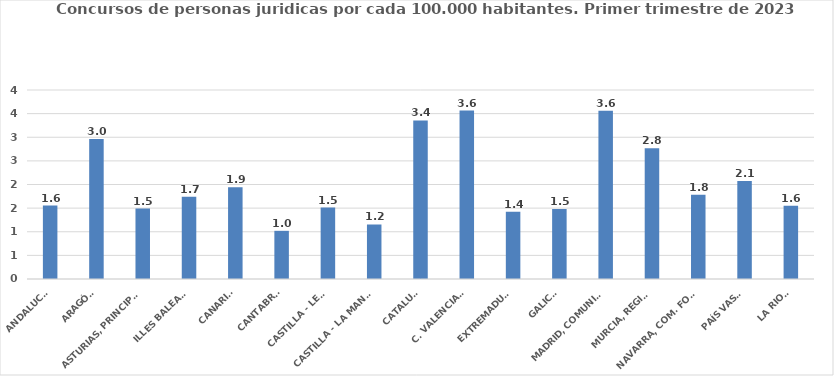
| Category | Series 0 |
|---|---|
| ANDALUCÍA | 1.555 |
| ARAGÓN | 2.964 |
| ASTURIAS, PRINCIPADO | 1.49 |
| ILLES BALEARS | 1.74 |
| CANARIAS | 1.943 |
| CANTABRIA | 1.019 |
| CASTILLA - LEÓN | 1.511 |
| CASTILLA - LA MANCHA | 1.153 |
| CATALUÑA | 3.355 |
| C. VALENCIANA | 3.564 |
| EXTREMADURA | 1.423 |
| GALICIA | 1.482 |
| MADRID, COMUNIDAD | 3.563 |
| MURCIA, REGIÓN | 2.769 |
| NAVARRA, COM. FORAL | 1.785 |
| PAÍS VASCO | 2.072 |
| LA RIOJA | 1.552 |